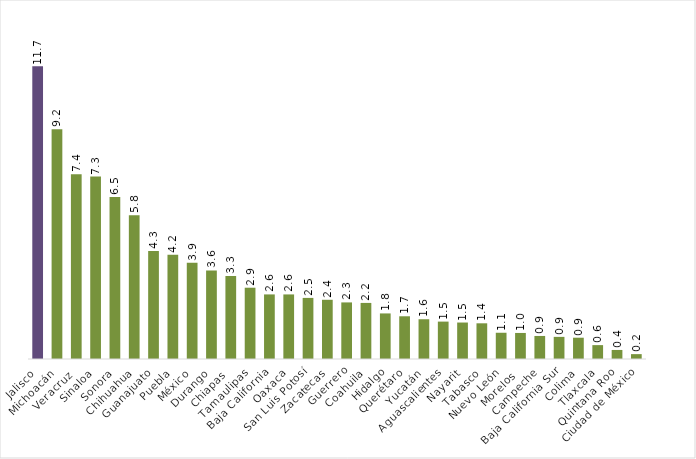
| Category | Series 0 |
|---|---|
| Jalisco | 11.744 |
| Michoacán | 9.218 |
| Veracruz  | 7.409 |
| Sinaloa | 7.32 |
| Sonora | 6.498 |
| Chihuahua | 5.762 |
| Guanajuato | 4.334 |
| Puebla | 4.178 |
| México | 3.86 |
| Durango | 3.551 |
| Chiapas  | 3.329 |
| Tamaulipas | 2.859 |
| Baja California | 2.591 |
| Oaxaca | 2.59 |
| San Luis Potosí | 2.45 |
| Zacatecas | 2.376 |
| Guerrero | 2.27 |
| Coahuila | 2.25 |
| Hidalgo | 1.828 |
| Querétaro | 1.714 |
| Yucatán | 1.595 |
| Aguascalientes | 1.5 |
| Nayarit  | 1.463 |
| Tabasco | 1.432 |
| Nuevo León | 1.053 |
| Morelos  | 1.045 |
| Campeche  | 0.924 |
| Baja California Sur | 0.888 |
| Colima | 0.854 |
| Tlaxcala | 0.557 |
| Quintana Roo | 0.363 |
| Ciudad de México | 0.196 |